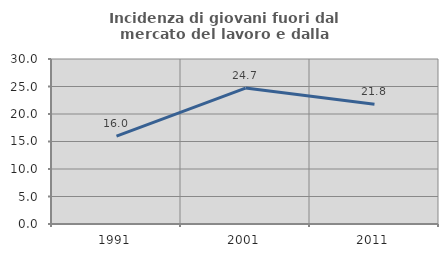
| Category | Incidenza di giovani fuori dal mercato del lavoro e dalla formazione  |
|---|---|
| 1991.0 | 15.991 |
| 2001.0 | 24.721 |
| 2011.0 | 21.759 |